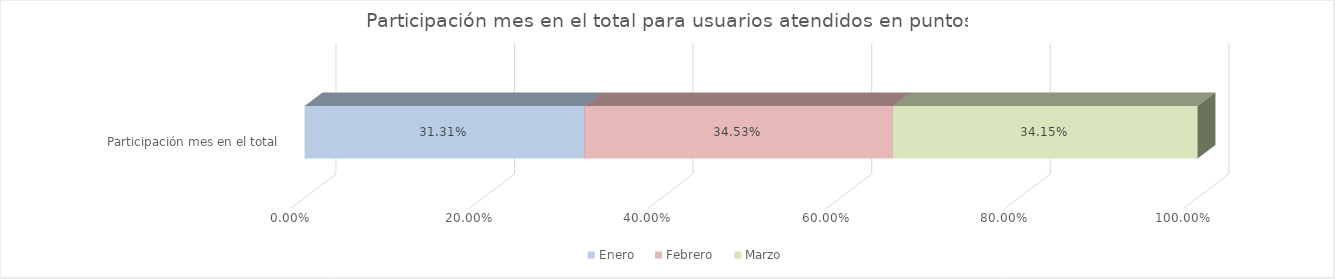
| Category | Enero | Febrero | Marzo |
|---|---|---|---|
| Participación mes en el total | 0.313 | 0.345 | 0.342 |